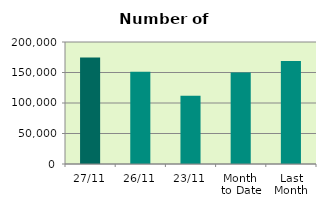
| Category | Series 0 |
|---|---|
| 27/11 | 174662 |
| 26/11 | 151358 |
| 23/11 | 111870 |
| Month 
to Date | 150059.474 |
| Last
Month | 168717.043 |